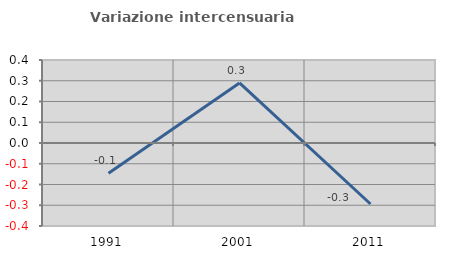
| Category | Variazione intercensuaria annua |
|---|---|
| 1991.0 | -0.145 |
| 2001.0 | 0.289 |
| 2011.0 | -0.294 |